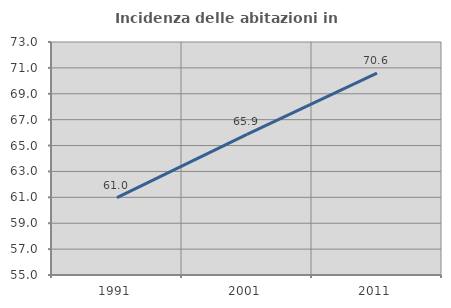
| Category | Incidenza delle abitazioni in proprietà  |
|---|---|
| 1991.0 | 60.974 |
| 2001.0 | 65.869 |
| 2011.0 | 70.597 |